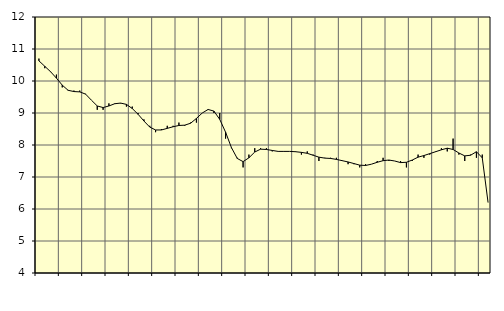
| Category | Piggar | Tillverkning av verkstadsvaror, SNI 25-30, 33 |
|---|---|---|
| nan | 10.7 | 10.63 |
| 1.0 | 10.4 | 10.46 |
| 1.0 | 10.3 | 10.29 |
| 1.0 | 10.2 | 10.09 |
| nan | 9.8 | 9.87 |
| 2.0 | 9.7 | 9.71 |
| 2.0 | 9.7 | 9.67 |
| 2.0 | 9.7 | 9.66 |
| nan | 9.6 | 9.59 |
| 3.0 | 9.4 | 9.4 |
| 3.0 | 9.1 | 9.22 |
| 3.0 | 9.1 | 9.17 |
| nan | 9.3 | 9.22 |
| 4.0 | 9.3 | 9.29 |
| 4.0 | 9.3 | 9.31 |
| 4.0 | 9.2 | 9.27 |
| nan | 9.2 | 9.14 |
| 5.0 | 9 | 8.96 |
| 5.0 | 8.8 | 8.75 |
| 5.0 | 8.6 | 8.56 |
| nan | 8.4 | 8.47 |
| 6.0 | 8.5 | 8.47 |
| 6.0 | 8.6 | 8.52 |
| 6.0 | 8.6 | 8.57 |
| nan | 8.7 | 8.61 |
| 7.0 | 8.6 | 8.62 |
| 7.0 | 8.7 | 8.68 |
| 7.0 | 8.7 | 8.83 |
| nan | 9 | 9 |
| 8.0 | 9.1 | 9.11 |
| 8.0 | 9 | 9.06 |
| 8.0 | 9 | 8.8 |
| nan | 8.2 | 8.4 |
| 9.0 | 7.9 | 7.92 |
| 9.0 | 7.6 | 7.58 |
| 9.0 | 7.3 | 7.48 |
| nan | 7.7 | 7.6 |
| 10.0 | 7.9 | 7.78 |
| 10.0 | 7.9 | 7.87 |
| 10.0 | 7.9 | 7.86 |
| nan | 7.8 | 7.83 |
| 11.0 | 7.8 | 7.8 |
| 11.0 | 7.8 | 7.8 |
| 11.0 | 7.8 | 7.8 |
| nan | 7.8 | 7.79 |
| 12.0 | 7.7 | 7.77 |
| 12.0 | 7.8 | 7.74 |
| 12.0 | 7.7 | 7.68 |
| nan | 7.5 | 7.62 |
| 13.0 | 7.6 | 7.59 |
| 13.0 | 7.6 | 7.58 |
| 13.0 | 7.6 | 7.55 |
| nan | 7.5 | 7.51 |
| 14.0 | 7.4 | 7.47 |
| 14.0 | 7.4 | 7.42 |
| 14.0 | 7.3 | 7.37 |
| nan | 7.4 | 7.36 |
| 15.0 | 7.4 | 7.4 |
| 15.0 | 7.5 | 7.46 |
| 15.0 | 7.6 | 7.51 |
| nan | 7.5 | 7.53 |
| 16.0 | 7.5 | 7.5 |
| 16.0 | 7.5 | 7.45 |
| 16.0 | 7.3 | 7.46 |
| nan | 7.5 | 7.53 |
| 17.0 | 7.7 | 7.62 |
| 17.0 | 7.6 | 7.67 |
| 17.0 | 7.7 | 7.73 |
| nan | 7.8 | 7.79 |
| 18.0 | 7.9 | 7.85 |
| 18.0 | 7.8 | 7.9 |
| 18.0 | 8.2 | 7.86 |
| nan | 7.7 | 7.75 |
| 19.0 | 7.5 | 7.66 |
| 19.0 | 7.7 | 7.68 |
| 19.0 | 7.6 | 7.79 |
| nan | 7.7 | 7.6 |
| 20.0 | 6.2 | 6.2 |